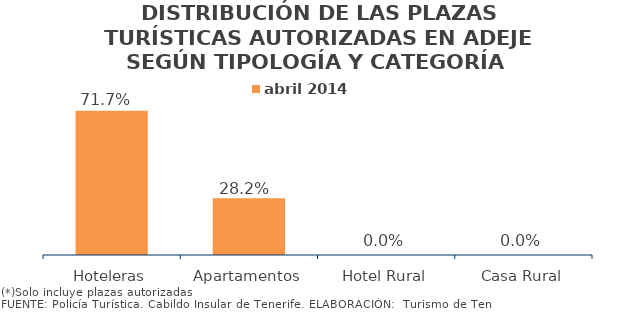
| Category | abril 2014 |
|---|---|
| Hoteleras | 0.717 |
| Apartamentos | 0.282 |
| Hotel Rural | 0 |
| Casa Rural | 0 |